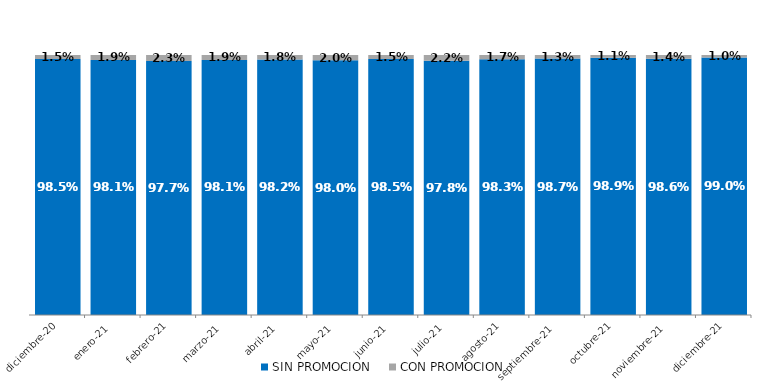
| Category | SIN PROMOCION   | CON PROMOCION   |
|---|---|---|
| 2020-12-01 | 0.985 | 0.015 |
| 2021-01-01 | 0.981 | 0.019 |
| 2021-02-01 | 0.977 | 0.023 |
| 2021-03-01 | 0.981 | 0.019 |
| 2021-04-01 | 0.982 | 0.018 |
| 2021-05-01 | 0.98 | 0.02 |
| 2021-06-01 | 0.985 | 0.015 |
| 2021-07-01 | 0.978 | 0.022 |
| 2021-08-01 | 0.983 | 0.017 |
| 2021-09-01 | 0.987 | 0.013 |
| 2021-10-01 | 0.989 | 0.011 |
| 2021-11-01 | 0.986 | 0.014 |
| 2021-12-01 | 0.99 | 0.01 |